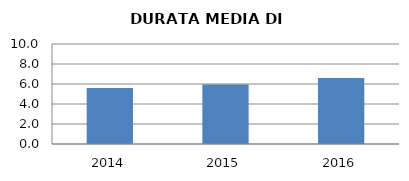
| Category | 2014 2015 2016 |
|---|---|
| 2014.0 | 5.598 |
| 2015.0 | 5.94 |
| 2016.0 | 6.591 |